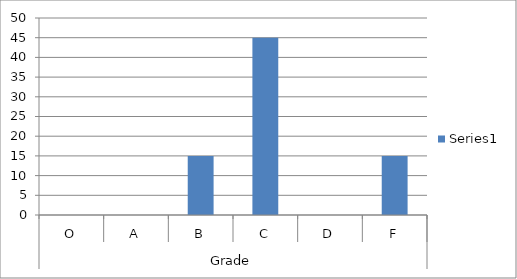
| Category | Series 0 |
|---|---|
| 0 | 0 |
| 1 | 0 |
| 2 | 15 |
| 3 | 45 |
| 4 | 0 |
| 5 | 15 |